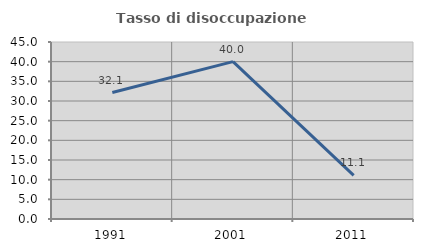
| Category | Tasso di disoccupazione giovanile  |
|---|---|
| 1991.0 | 32.143 |
| 2001.0 | 40 |
| 2011.0 | 11.111 |